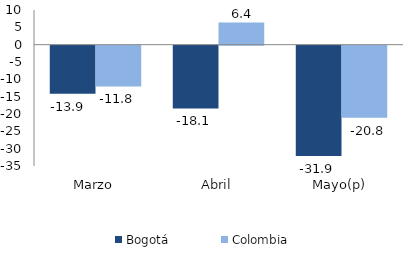
| Category | Bogotá | Colombia |
|---|---|---|
| Marzo | -13.899 | -11.77 |
| Abril | -18.09 | 6.368 |
| Mayo(p) | -31.853 | -20.79 |